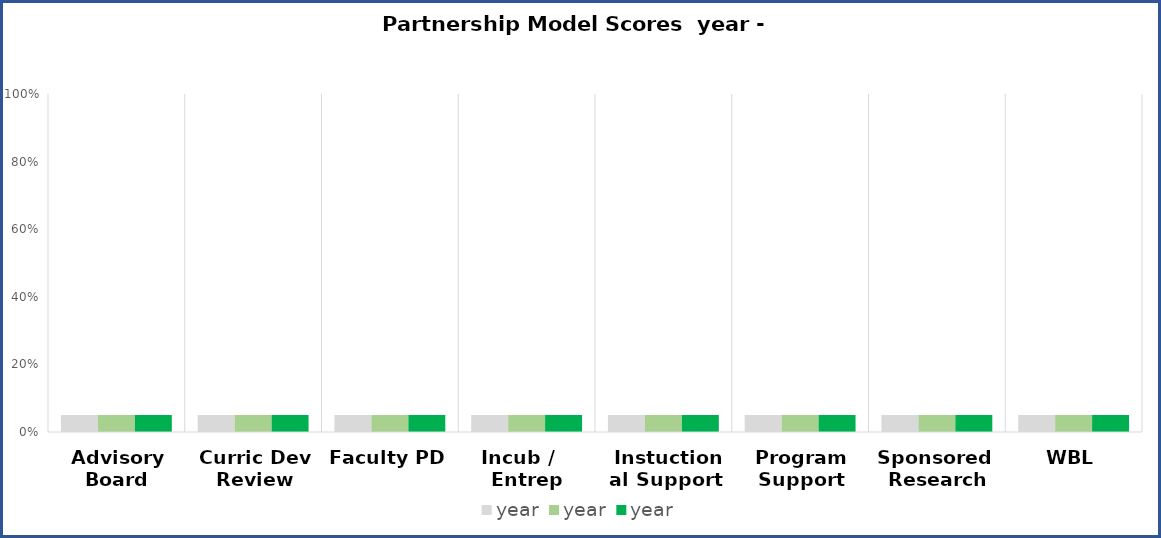
| Category | year |
|---|---|
| Advisory Board | 0.05 |
| Curric Dev Review | 0.05 |
| Faculty PD | 0.05 |
| Incub /    Entrep | 0.05 |
|  Instuctional Support | 0.05 |
| Program Support | 0.05 |
| Sponsored  Research | 0.05 |
| WBL | 0.05 |